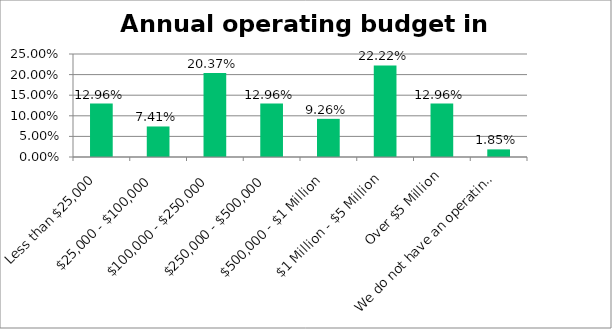
| Category | Responses |
|---|---|
| Less than $25,000 | 0.13 |
| $25,000 - $100,000 | 0.074 |
| $100,000 - $250,000 | 0.204 |
| $250,000 - $500,000 | 0.13 |
| $500,000 - $1 Million | 0.093 |
| $1 Million - $5 Million | 0.222 |
| Over $5 Million | 0.13 |
| We do not have an operating budget | 0.018 |